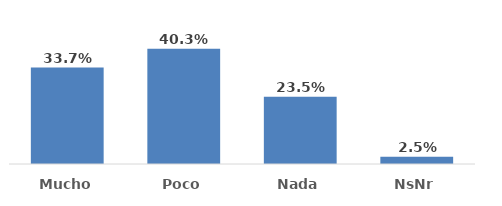
| Category | Series 0 |
|---|---|
| Mucho  | 0.337 |
| Poco | 0.403 |
| Nada | 0.235 |
| NsNr | 0.025 |